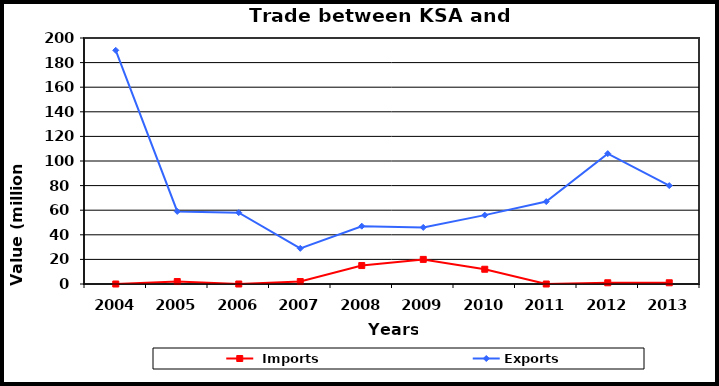
| Category |  Imports | Exports |
|---|---|---|
| 2004.0 | 0 | 190 |
| 2005.0 | 2 | 59 |
| 2006.0 | 0 | 58 |
| 2007.0 | 2 | 29 |
| 2008.0 | 15 | 47 |
| 2009.0 | 20 | 46 |
| 2010.0 | 12 | 56 |
| 2011.0 | 0 | 67 |
| 2012.0 | 1 | 106 |
| 2013.0 | 1 | 80 |